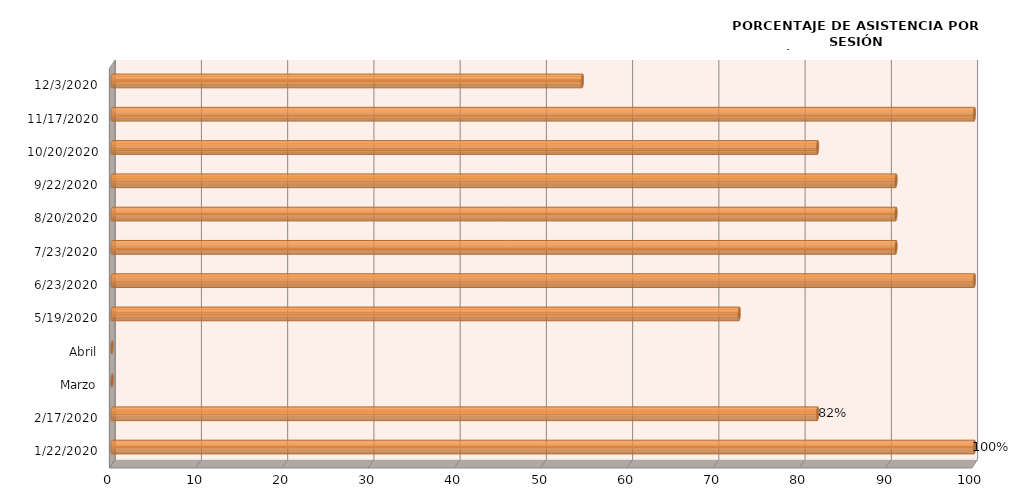
| Category | Series 0 |
|---|---|
| 22/01/2020 | 100 |
| 17/02/2020 | 81.818 |
| Marzo | 0 |
| Abril | 0 |
| 19/05/2020 | 72.727 |
| 23/06/2020 | 100 |
| 23/07/2020 | 90.909 |
| 20/08/2020 | 90.909 |
| 22/09/2020 | 90.909 |
| 20/10/2020 | 81.818 |
| 17/11/2020 | 100 |
| 03/12/2020 | 54.545 |